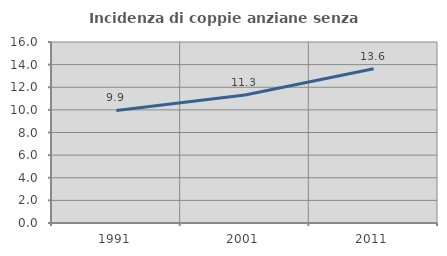
| Category | Incidenza di coppie anziane senza figli  |
|---|---|
| 1991.0 | 9.948 |
| 2001.0 | 11.307 |
| 2011.0 | 13.633 |